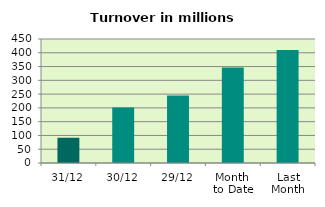
| Category | Series 0 |
|---|---|
| 31/12 | 91.637 |
| 30/12 | 201.859 |
| 29/12 | 244.739 |
| Month 
to Date | 346.191 |
| Last
Month | 410.338 |